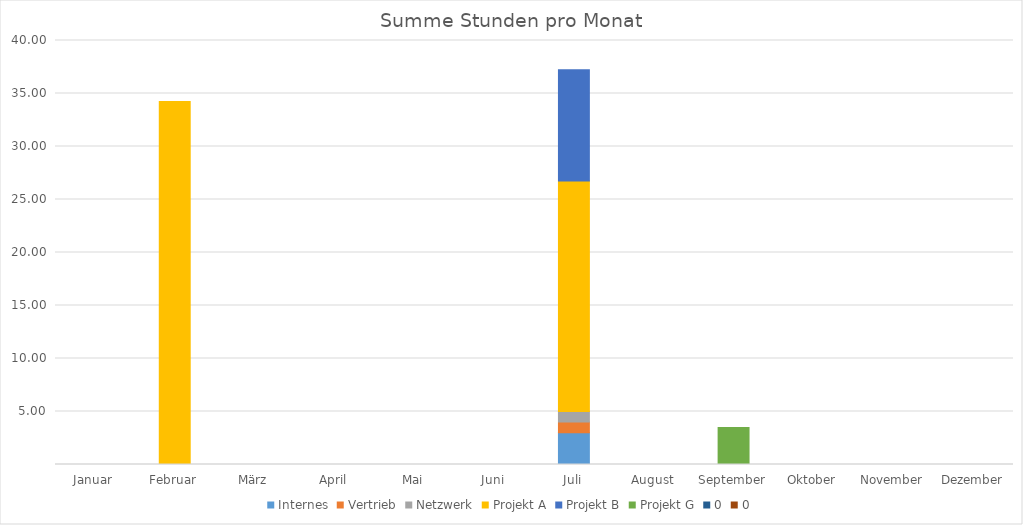
| Category | Internes | Vertrieb | Netzwerk | Projekt A | Projekt B | Projekt G | 0 |
|---|---|---|---|---|---|---|---|
| Januar | 0 | 0 | 0 | 0 | 0 | 0 | 0 |
| Februar | 0 | 0 | 0 | 34.25 | 0 | 0 | 0 |
| März | 0 | 0 | 0 | 0 | 0 | 0 | 0 |
| April | 0 | 0 | 0 | 0 | 0 | 0 | 0 |
| Mai | 0 | 0 | 0 | 0 | 0 | 0 | 0 |
| Juni | 0 | 0 | 0 | 0 | 0 | 0 | 0 |
| Juli | 3 | 1 | 1 | 21.75 | 10.5 | 0 | 0 |
| August | 0 | 0 | 0 | 0 | 0 | 0 | 0 |
| September | 0 | 0 | 0 | 0 | 0 | 3.5 | 0 |
| Oktober | 0 | 0 | 0 | 0 | 0 | 0 | 0 |
| November | 0 | 0 | 0 | 0 | 0 | 0 | 0 |
| Dezember | 0 | 0 | 0 | 0 | 0 | 0 | 0 |